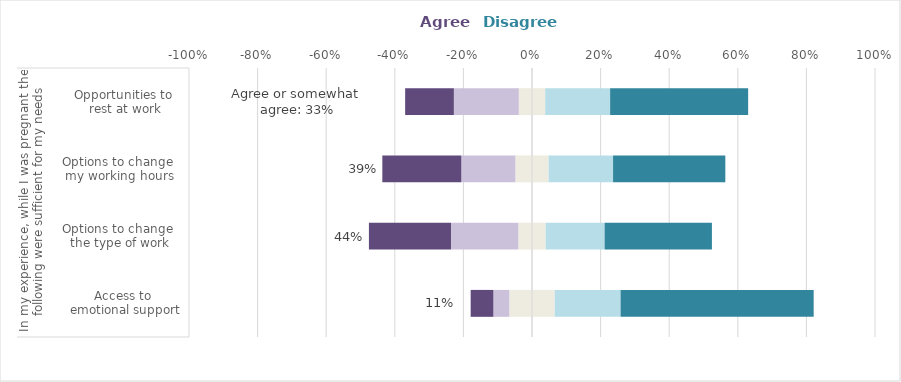
| Category | Neither agree nor disagree | Somewhat agree | Agree | Somewhat disagree | Disagree |
|---|---|---|---|---|---|
| 0 | 0.066 | -0.046 | -0.066 | 0.192 | 0.563 |
| 1 | 0.04 | -0.196 | -0.239 | 0.172 | 0.313 |
| 2 | 0.048 | -0.158 | -0.23 | 0.188 | 0.327 |
| 3 | 0.038 | -0.189 | -0.142 | 0.189 | 0.402 |